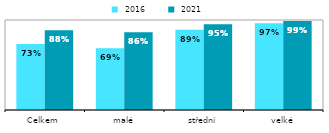
| Category |  2016 |  2021 |
|---|---|---|
| Celkem | 0.733 | 0.885 |
| malé | 0.687 | 0.864 |
| střední | 0.891 | 0.954 |
| velké | 0.965 | 0.988 |